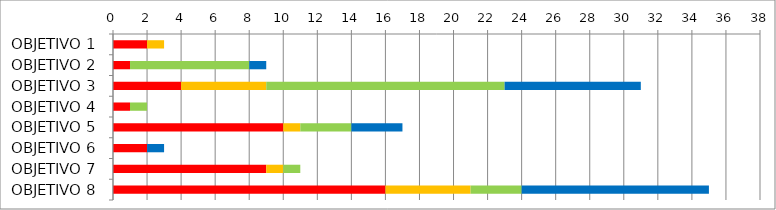
| Category | Series 1 | Series 2 | Series 3 | Series 4 | Series 5 |
|---|---|---|---|---|---|
| OBJETIVO 1 | 0 | 2 | 1 | 0 | 0 |
| OBJETIVO 2 | 0 | 1 | 0 | 7 | 1 |
| OBJETIVO 3 | 0 | 4 | 5 | 14 | 8 |
| OBJETIVO 4 | 0 | 1 | 0 | 1 | 0 |
| OBJETIVO 5 | 0 | 10 | 1 | 3 | 3 |
| OBJETIVO 6 | 0 | 2 | 0 | 0 | 1 |
| OBJETIVO 7 | 0 | 9 | 1 | 1 | 0 |
| OBJETIVO 8 | 0 | 16 | 5 | 3 | 11 |